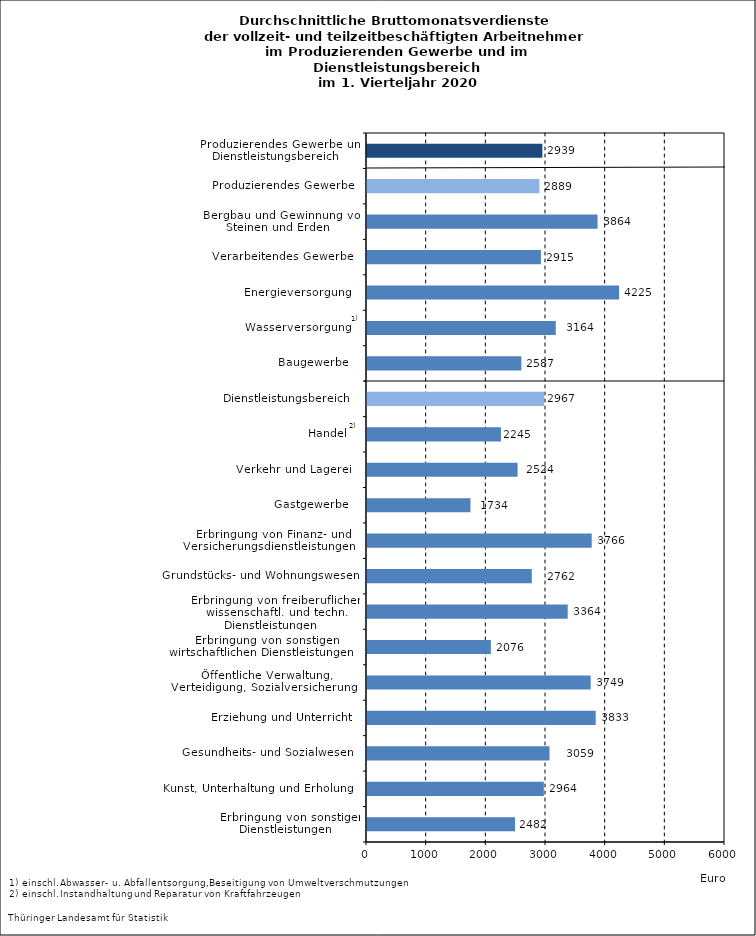
| Category | Series 0 |
|---|---|
| Erbringung von sonstigen Dienstleistungen    | 2482 |
| Kunst, Unterhaltung und Erholung    | 2964 |
| Gesundheits- und Sozialwesen    | 3059 |
| Erziehung und Unterricht    | 3833 |
| Öffentliche Verwaltung, Verteidigung, Sozialversicherung    | 3749 |
| Erbringung von sonstigen wirtschaftlichen Dienstleistungen    | 2076 |
| Erbringung von freiberuflichen, wissenschaftl. und techn. Dienstleistungen    | 3364 |
| Grundstücks- und Wohnungswesen    | 2762 |
| Erbringung von Finanz- und Versicherungsdienstleistungen    | 3766 |
| Gastgewerbe    | 1734 |
| Verkehr und Lagerei    | 2524 |
| Handel    | 2245 |
| Dienstleistungsbereich    | 2967 |
| Baugewerbe    | 2587 |
| Wasserversorgung    | 3164 |
| Energieversorgung    | 4225 |
| Verarbeitendes Gewerbe    | 2915 |
| Bergbau und Gewinnung von Steinen und Erden    | 3864 |
| Produzierendes Gewerbe    | 2889 |
| Produzierendes Gewerbe und Dienstleistungsbereich    | 2939 |